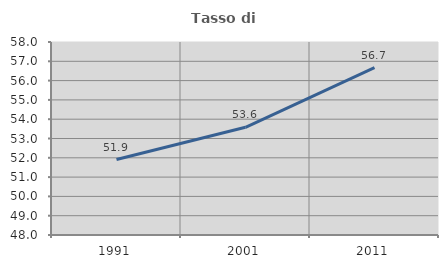
| Category | Tasso di occupazione   |
|---|---|
| 1991.0 | 51.911 |
| 2001.0 | 53.582 |
| 2011.0 | 56.667 |